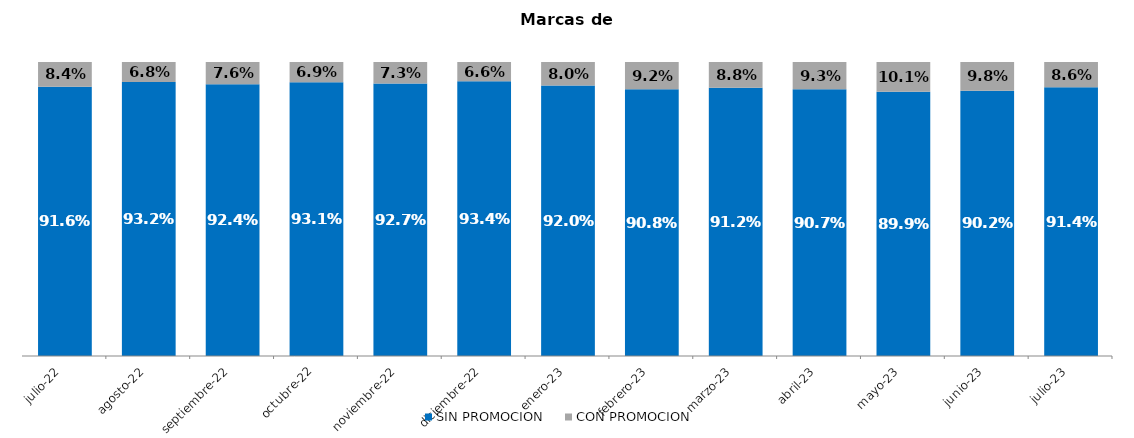
| Category | SIN PROMOCION   | CON PROMOCION   |
|---|---|---|
| 2022-07-01 | 0.916 | 0.084 |
| 2022-08-01 | 0.932 | 0.068 |
| 2022-09-01 | 0.924 | 0.076 |
| 2022-10-01 | 0.931 | 0.069 |
| 2022-11-01 | 0.927 | 0.073 |
| 2022-12-01 | 0.934 | 0.066 |
| 2023-01-01 | 0.92 | 0.08 |
| 2023-02-01 | 0.908 | 0.092 |
| 2023-03-01 | 0.912 | 0.088 |
| 2023-04-01 | 0.907 | 0.093 |
| 2023-05-01 | 0.899 | 0.101 |
| 2023-06-01 | 0.902 | 0.098 |
| 2023-07-01 | 0.914 | 0.086 |